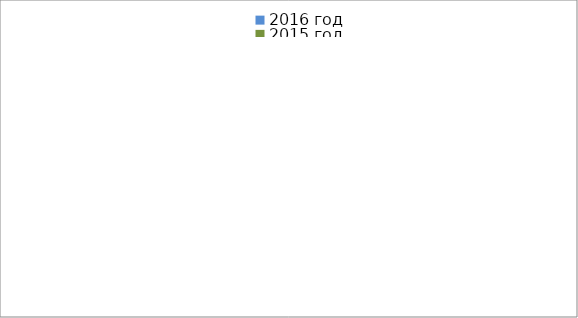
| Category | 2016 год | 2015 год |
|---|---|---|
|  - поджог | 15 | 4 |
|  - неосторожное обращение с огнём | 11 | 17 |
|  - НПТЭ электрооборудования | 2 | 2 |
|  - НПУ и Э печей | 13 | 16 |
|  - НПУ и Э транспортных средств | 8 | 22 |
|   -Шалость с огнем детей | 1 | 1 |
|  -НППБ при эксплуатации эл.приборов | 2 | 7 |
|  - курение | 0 | 7 |
| - прочие | 29 | 32 |
| - не установленные причины | 9 | 2 |